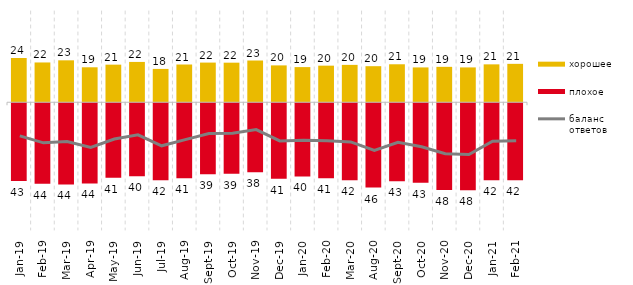
| Category | хорошее | плохое |
|---|---|---|
| 2019-01-01 | 24.25 | -42.65 |
| 2019-02-01 | 21.8 | -44.05 |
| 2019-03-01 | 22.974 | -44.455 |
| 2019-04-01 | 19.158 | -43.96 |
| 2019-05-01 | 20.604 | -40.763 |
| 2019-06-01 | 22.095 | -39.95 |
| 2019-07-01 | 18.267 | -42.129 |
| 2019-08-01 | 20.679 | -41.159 |
| 2019-09-01 | 21.733 | -38.911 |
| 2019-10-01 | 21.683 | -38.614 |
| 2019-11-01 | 22.871 | -37.871 |
| 2019-12-01 | 20.198 | -41.386 |
| 2020-01-01 | 19.257 | -40.099 |
| 2020-02-01 | 20.05 | -41.089 |
| 2020-03-01 | 20.476 | -42.191 |
| 2020-08-01 | 19.762 | -46.177 |
| 2020-09-01 | 20.806 | -42.758 |
| 2020-10-01 | 19.083 | -43.498 |
| 2020-11-01 | 19.4 | -47.6 |
| 2020-12-01 | 19.088 | -47.695 |
| 2021-01-01 | 20.765 | -42.126 |
| 2021-02-01 | 21.042 | -42.134 |